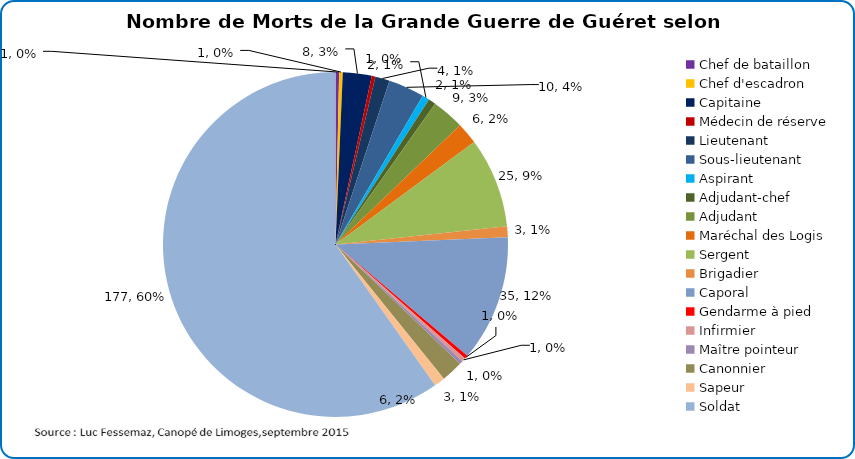
| Category | Nombre de Morts de la Grande Guerre de Guéret selon le grade |
|---|---|
| Chef de bataillon | 1 |
| Chef d'escadron | 1 |
| Capitaine | 8 |
| Médecin de réserve | 1 |
| Lieutenant | 4 |
| Sous-lieutenant | 10 |
| Aspirant  | 2 |
| Adjudant-chef  | 2 |
| Adjudant | 9 |
| Maréchal des Logis | 6 |
| Sergent   | 25 |
| Brigadier | 3 |
| Caporal   | 35 |
| Gendarme à pied | 1 |
| Infirmier | 1 |
| Maître pointeur | 1 |
| Canonnier | 6 |
| Sapeur | 3 |
| Soldat | 177 |